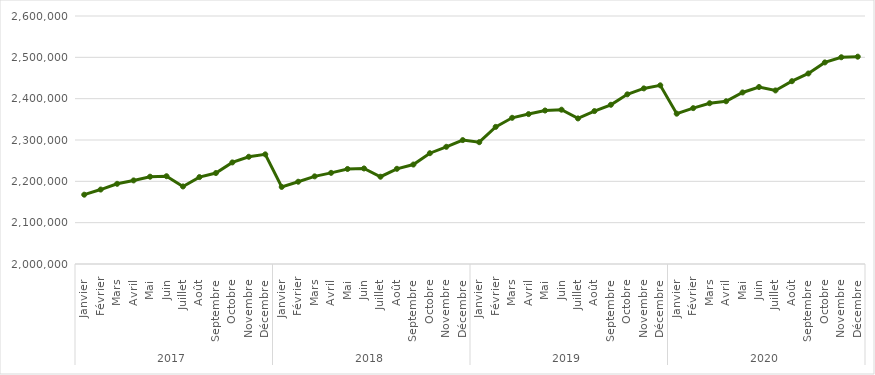
| Category | Nombre d'allocataires des Caf en Île-de-France |
|---|---|
| 0 | 2167697 |
| 1 | 2180116 |
| 2 | 2194011 |
| 3 | 2202203 |
| 4 | 2211222 |
| 5 | 2212394 |
| 6 | 2187585 |
| 7 | 2210286 |
| 8 | 2220079 |
| 9 | 2245739 |
| 10 | 2259424 |
| 11 | 2265281 |
| 12 | 2186495 |
| 13 | 2199036 |
| 14 | 2212022 |
| 15 | 2220502 |
| 16 | 2229898 |
| 17 | 2231124 |
| 18 | 2211151 |
| 19 | 2230335 |
| 20 | 2240604 |
| 21 | 2268036 |
| 22 | 2283549 |
| 23 | 2299755 |
| 24 | 2294698 |
| 25 | 2331750 |
| 26 | 2353712 |
| 27 | 2362700 |
| 28 | 2371349 |
| 29 | 2373302 |
| 30 | 2352168 |
| 31 | 2369987 |
| 32 | 2385212 |
| 33 | 2410469 |
| 34 | 2424825 |
| 35 | 2432287 |
| 36 | 2363668 |
| 37 | 2377099 |
| 38 | 2388962 |
| 39 | 2393716 |
| 40 | 2415036 |
| 41 | 2428214 |
| 42 | 2419906 |
| 43 | 2442259 |
| 44 | 2460931 |
| 45 | 2487679 |
| 46 | 2500200 |
| 47 | 2501592 |